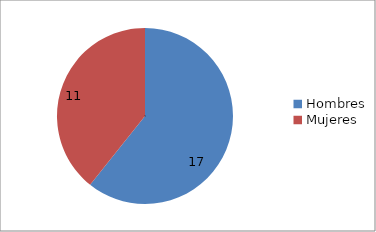
| Category | Series 0 |
|---|---|
| Hombres | 17 |
| Mujeres | 11 |